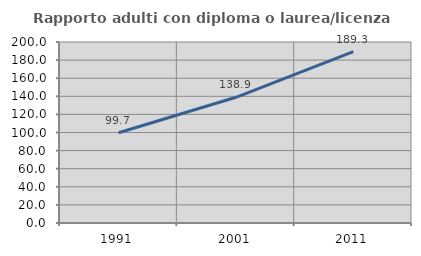
| Category | Rapporto adulti con diploma o laurea/licenza media  |
|---|---|
| 1991.0 | 99.714 |
| 2001.0 | 138.913 |
| 2011.0 | 189.299 |